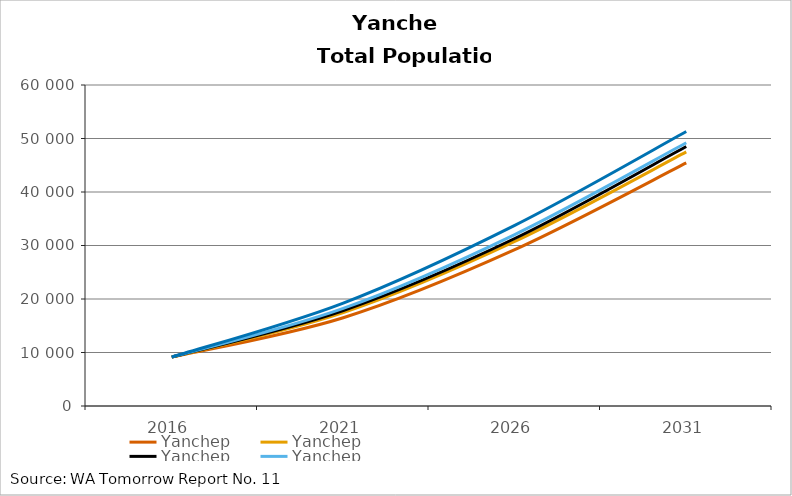
| Category | A | B | C | D | E |
|---|---|---|---|---|---|
| 2016 | 9145 | 9145 | 9145 | 9145 | 9145 |
| 2021 | 16505 | 17465 | 17845 | 18250 | 19240 |
| 2026 | 29225 | 30760 | 31310 | 32050 | 33770 |
| 2031 | 45430 | 47490 | 48500 | 49200 | 51300 |